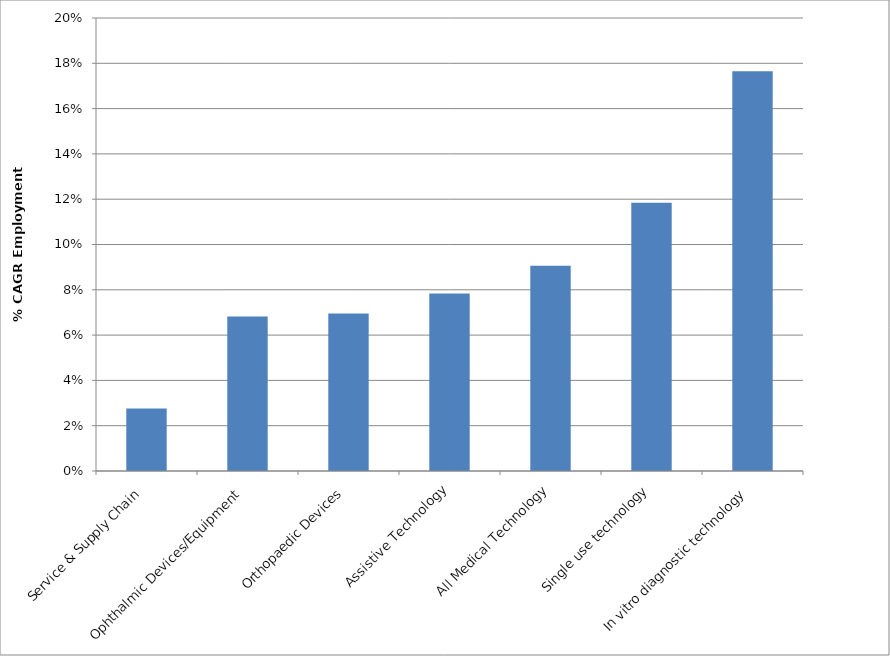
| Category | % CAGR 2009-2014 |
|---|---|
| Service & Supply Chain | 0.028 |
| Ophthalmic Devices/Equipment | 0.068 |
| Orthopaedic Devices | 0.07 |
| Assistive Technology | 0.078 |
| All Medical Technology | 0.091 |
| Single use technology | 0.118 |
| In vitro diagnostic technology | 0.176 |